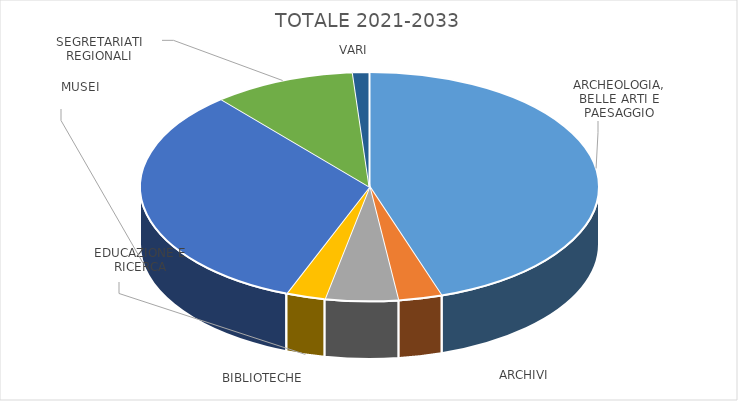
| Category | TOTALE 2021-2033 |
|---|---|
| ARCHEOLOGIA, BELLE ARTI E PAESAGGIO | 416480806.323 |
| ARCHIVI | 28518612.058 |
| BIBLIOTECHE | 47591625.768 |
| EDUCAZIONE E RICERCA | 25660000 |
| MUSEI | 305190094 |
| SEGRETARIATI REGIONALI | 92933946.46 |
| VARI | 10814293.39 |